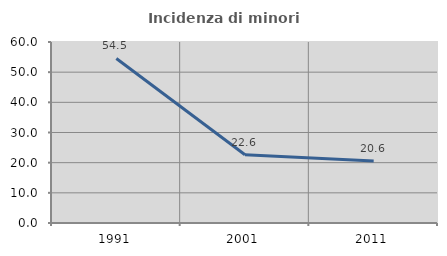
| Category | Incidenza di minori stranieri |
|---|---|
| 1991.0 | 54.545 |
| 2001.0 | 22.619 |
| 2011.0 | 20.574 |